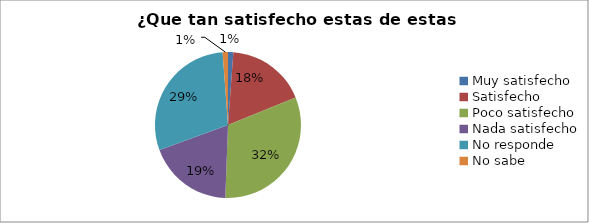
| Category | Series 0 |
|---|---|
| Muy satisfecho | 0.012 |
| Satisfecho | 0.176 |
| Poco satisfecho | 0.318 |
| Nada satisfecho | 0.188 |
| No responde | 0.294 |
| No sabe | 0.012 |